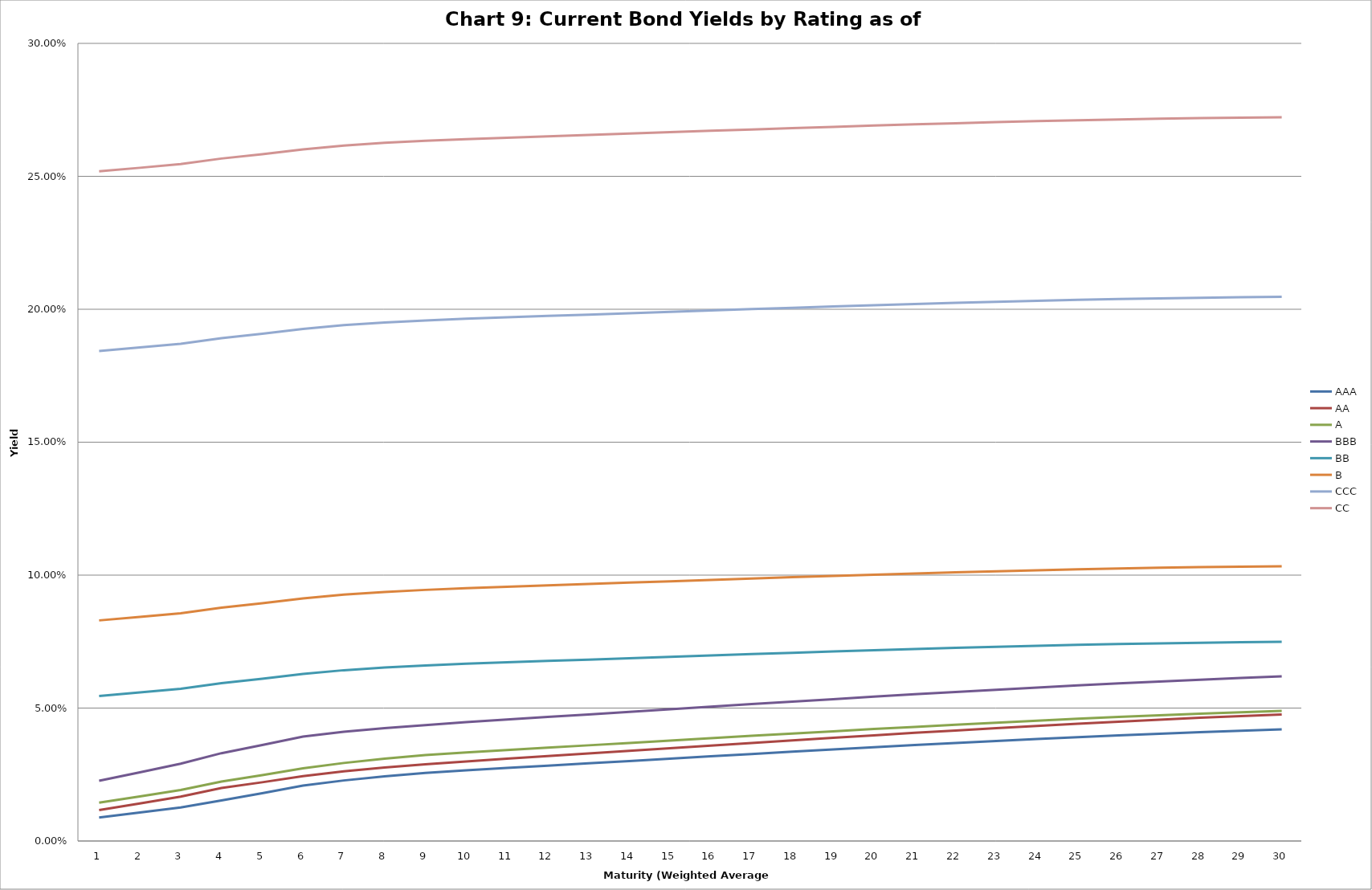
| Category | AAA | AA | A | BBB | BB | B | CCC | CC |
|---|---|---|---|---|---|---|---|---|
| 0 | 0.009 | 0.012 | 0.014 | 0.023 | 0.055 | 0.083 | 0.184 | 0.252 |
| 1 | 0.011 | 0.014 | 0.017 | 0.026 | 0.056 | 0.084 | 0.186 | 0.253 |
| 2 | 0.013 | 0.017 | 0.019 | 0.029 | 0.057 | 0.086 | 0.187 | 0.255 |
| 3 | 0.015 | 0.02 | 0.022 | 0.033 | 0.059 | 0.088 | 0.189 | 0.257 |
| 4 | 0.018 | 0.022 | 0.025 | 0.036 | 0.061 | 0.089 | 0.191 | 0.258 |
| 5 | 0.021 | 0.024 | 0.027 | 0.039 | 0.063 | 0.091 | 0.193 | 0.26 |
| 6 | 0.023 | 0.026 | 0.029 | 0.041 | 0.064 | 0.093 | 0.194 | 0.262 |
| 7 | 0.024 | 0.028 | 0.031 | 0.042 | 0.065 | 0.094 | 0.195 | 0.263 |
| 8 | 0.026 | 0.029 | 0.032 | 0.044 | 0.066 | 0.094 | 0.196 | 0.263 |
| 9 | 0.027 | 0.03 | 0.033 | 0.045 | 0.067 | 0.095 | 0.196 | 0.264 |
| 10 | 0.027 | 0.031 | 0.034 | 0.046 | 0.067 | 0.096 | 0.197 | 0.265 |
| 11 | 0.028 | 0.032 | 0.035 | 0.047 | 0.068 | 0.096 | 0.197 | 0.265 |
| 12 | 0.029 | 0.033 | 0.036 | 0.048 | 0.068 | 0.097 | 0.198 | 0.266 |
| 13 | 0.03 | 0.034 | 0.037 | 0.049 | 0.069 | 0.097 | 0.199 | 0.266 |
| 14 | 0.031 | 0.035 | 0.038 | 0.05 | 0.069 | 0.098 | 0.199 | 0.267 |
| 15 | 0.032 | 0.036 | 0.039 | 0.051 | 0.07 | 0.098 | 0.2 | 0.267 |
| 16 | 0.033 | 0.037 | 0.04 | 0.051 | 0.07 | 0.099 | 0.2 | 0.268 |
| 17 | 0.034 | 0.038 | 0.04 | 0.052 | 0.071 | 0.099 | 0.201 | 0.268 |
| 18 | 0.034 | 0.039 | 0.041 | 0.053 | 0.071 | 0.1 | 0.201 | 0.269 |
| 19 | 0.035 | 0.04 | 0.042 | 0.054 | 0.072 | 0.1 | 0.202 | 0.269 |
| 20 | 0.036 | 0.041 | 0.043 | 0.055 | 0.072 | 0.101 | 0.202 | 0.27 |
| 21 | 0.037 | 0.042 | 0.044 | 0.056 | 0.073 | 0.101 | 0.202 | 0.27 |
| 22 | 0.038 | 0.042 | 0.045 | 0.057 | 0.073 | 0.101 | 0.203 | 0.27 |
| 23 | 0.038 | 0.043 | 0.045 | 0.058 | 0.073 | 0.102 | 0.203 | 0.271 |
| 24 | 0.039 | 0.044 | 0.046 | 0.059 | 0.074 | 0.102 | 0.204 | 0.271 |
| 25 | 0.04 | 0.045 | 0.047 | 0.059 | 0.074 | 0.102 | 0.204 | 0.271 |
| 26 | 0.04 | 0.046 | 0.047 | 0.06 | 0.074 | 0.103 | 0.204 | 0.272 |
| 27 | 0.041 | 0.046 | 0.048 | 0.061 | 0.075 | 0.103 | 0.204 | 0.272 |
| 28 | 0.041 | 0.047 | 0.048 | 0.061 | 0.075 | 0.103 | 0.205 | 0.272 |
| 29 | 0.042 | 0.048 | 0.049 | 0.062 | 0.075 | 0.103 | 0.205 | 0.272 |